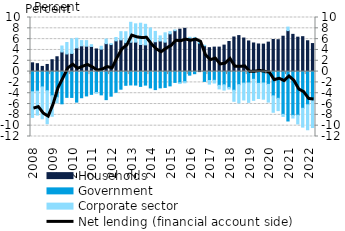
| Category | Households | Government | Corporate sector |
|---|---|---|---|
| 2008.0 | 1.621 | -3.734 | -4.732 |
| 2008.0 | 1.462 | -3.614 | -4.417 |
| 2008.0 | 0.957 | -2.83 | -5.897 |
| 2008.0 | 1.318 | -3.538 | -6.101 |
| 2009.0 | 2.194 | -4.465 | -3.796 |
| 2009.0 | 2.742 | -4.759 | -1.033 |
| 2009.0 | 3.626 | -5.956 | 1.105 |
| 2009.0 | 3.26 | -4.764 | 2.113 |
| 2010.0 | 3.36 | -4.776 | 2.682 |
| 2010.0 | 4.379 | -5.639 | 1.787 |
| 2010.0 | 4.761 | -4.833 | 0.971 |
| 2010.0 | 4.7 | -4.502 | 1.027 |
| 2011.0 | 4.649 | -4.208 | 0.328 |
| 2011.0 | 4.185 | -3.872 | -0.137 |
| 2011.0 | 4.158 | -4.3 | 0.525 |
| 2011.0 | 5.166 | -5.185 | 0.85 |
| 2012.0 | 4.998 | -4.545 | 0.169 |
| 2012.0 | 5.687 | -3.826 | 0.621 |
| 2012.0 | 5.862 | -3.256 | 1.519 |
| 2012.0 | 5.354 | -2.537 | 2.013 |
| 2013.0 | 5.433 | -2.467 | 3.68 |
| 2013.0 | 5.45 | -2.489 | 3.381 |
| 2013.0 | 5.013 | -2.735 | 3.932 |
| 2013.0 | 4.939 | -2.497 | 3.805 |
| 2014.0 | 5.336 | -3.015 | 2.73 |
| 2014.0 | 5.519 | -3.329 | 1.911 |
| 2014.0 | 5.657 | -3.008 | 0.941 |
| 2014.0 | 5.443 | -2.925 | 1.727 |
| 2015.0 | 6.986 | -2.637 | 0.404 |
| 2015.0 | 7.562 | -1.996 | 0.134 |
| 2015.0 | 7.839 | -2.068 | -0.143 |
| 2015.0 | 7.996 | -1.869 | -0.21 |
| 2016.0 | 6.211 | -0.655 | 0.137 |
| 2016.0 | 5.984 | -0.392 | 0.343 |
| 2016.0 | 5.236 | 0.088 | 0.173 |
| 2016.0 | 4.774 | -1.814 | 0.087 |
| 2017.0 | 4.421 | -1.653 | -0.663 |
| 2017.0 | 4.525 | -1.613 | -0.498 |
| 2017.0 | 4.526 | -2.541 | -0.659 |
| 2017.0 | 4.895 | -2.444 | -0.976 |
| 2018.0 | 5.562 | -2.929 | -0.292 |
| 2018.0 | 6.399 | -3.441 | -2.052 |
| 2018.0 | 6.655 | -2.419 | -3.366 |
| 2018.0 | 6.205 | -2.132 | -3.113 |
| 2019.0 | 5.664 | -2.106 | -3.588 |
| 2019.0 | 5.29 | -1.428 | -3.888 |
| 2019.0 | 5.108 | -2.177 | -2.797 |
| 2019.0 | 5.08 | -2.11 | -2.994 |
| 2020.0 | 5.445 | -2.361 | -3.279 |
| 2020.0 | 5.937 | -4.486 | -3.037 |
| 2020.0 | 5.895 | -4.94 | -2.273 |
| 2020.0 | 6.54 | -7.902 | -0.393 |
| 2021.0 | 7.577 | -9.134 | 0.649 |
| 2021.0 | 6.883 | -8.094 | -0.49 |
| 2021.0 | 6.363 | -8.063 | -1.615 |
| 2021.0 | 6.455 | -6.783 | -3.484 |
| 2022.0 | 5.702 | -6.14 | -4.614 |
| 2022.0 | 5.182 | -5.372 | -4.971 |